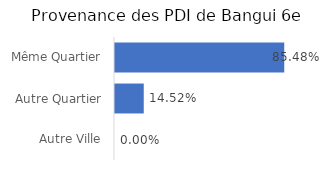
| Category | Provenance des PDI |
|---|---|
| Autre Ville | 0 |
| Autre Quartier | 0.145 |
| Même Quartier | 0.855 |